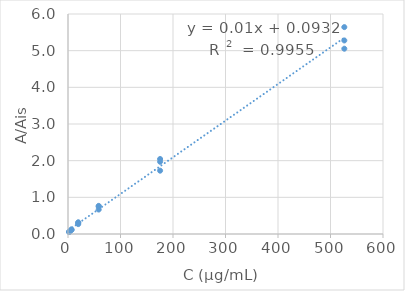
| Category | A/Ais |
|---|---|
| 2.165912499092598 | 0.056 |
| 2.165912499092598 | 0.059 |
| 2.165912499092598 | 0.054 |
| 6.497737497277795 | 0.122 |
| 6.497737497277795 | 0.12 |
| 6.497737497277795 | 0.107 |
| 19.493212491833383 | 0.319 |
| 19.493212491833383 | 0.304 |
| 19.493212491833383 | 0.27 |
| 58.47963747550015 | 0.749 |
| 58.47963747550015 | 0.767 |
| 58.47963747550015 | 0.667 |
| 175.43891242650045 | 2.046 |
| 175.43891242650045 | 1.971 |
| 175.43891242650045 | 1.727 |
| 526.3167372795014 | 5.279 |
| 526.3167372795014 | 5.642 |
| 526.3167372795014 | 5.053 |